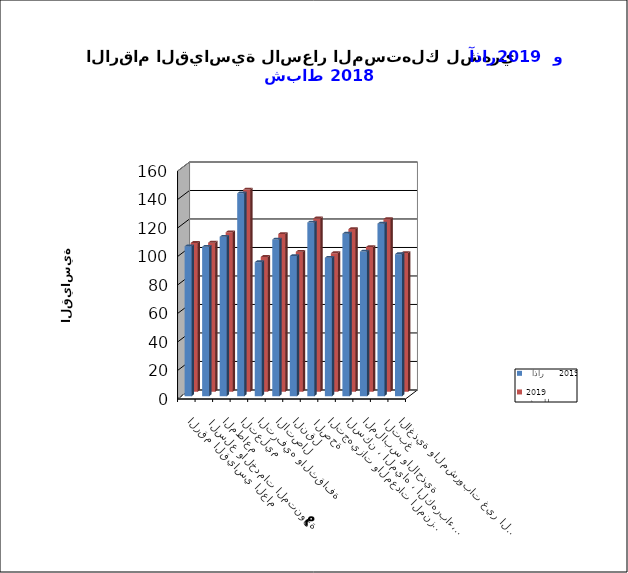
| Category |   آذار     2019      | شباط   2019      |
|---|---|---|
| الاغذية والمشروبات غير الكحولية | 99.7 | 97.3 |
|  التبغ | 121.1 | 121.1 |
| الملابس والاحذية | 101.5 | 101.5 |
| السكن ، المياه ، الكهرباء، الغاز  | 114.1 | 114.1 |
| التجهيزات والمعدات المنزلية والصيانة | 97.2 | 97.2 |
|  الصحة | 121.9 | 121.6 |
| النقل | 98.4 | 98.2 |
| الاتصال | 110 | 110.7 |
| الترفيه والثقافة | 94.1 | 94.6 |
| التعليم | 142.4 | 141.9 |
| المطاعم  | 111.9 | 111.9 |
|  السلع والخدمات المتنوعة | 104.9 | 104.6 |
| الرقم القياسي العام | 105.2 | 104.4 |